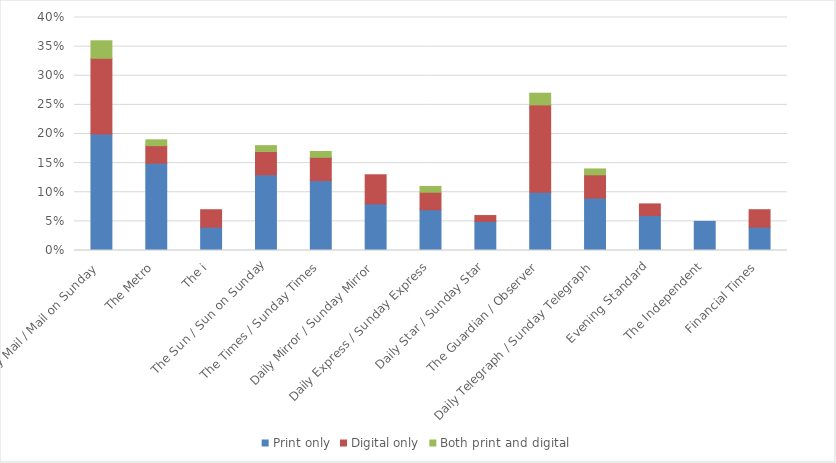
| Category | Print only | Digital only | Both print and digital |
|---|---|---|---|
| Daily Mail / Mail on Sunday | 0.2 | 0.13 | 0.03 |
| The Metro | 0.15 | 0.03 | 0.01 |
| The i | 0.04 | 0.03 | 0 |
| The Sun / Sun on Sunday | 0.13 | 0.04 | 0.01 |
| The Times / Sunday Times | 0.12 | 0.04 | 0.01 |
| Daily Mirror / Sunday Mirror | 0.08 | 0.05 | 0 |
| Daily Express / Sunday Express | 0.07 | 0.03 | 0.01 |
| Daily Star / Sunday Star | 0.05 | 0.01 | 0 |
| The Guardian / Observer | 0.1 | 0.15 | 0.02 |
| Daily Telegraph / Sunday Telegraph | 0.09 | 0.04 | 0.01 |
| Evening Standard | 0.06 | 0.02 | 0 |
| The Independent | 0.05 | 0 | 0 |
| Financial Times | 0.04 | 0.03 | 0 |